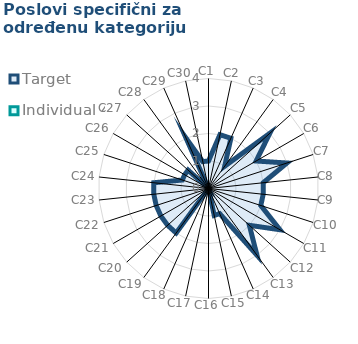
| Category | Target | Individual 4 |
|---|---|---|
| C1 | 1 | 0 |
| C2 | 2 | 0 |
| C3 | 2 | 0 |
| C4 | 1 | 0 |
| C5 | 3 | 0 |
| C6 | 2 | 0 |
| C7 | 3 | 0 |
| C8 | 2 | 0 |
| C9 | 2 | 0 |
| C10 | 2 | 0 |
| C11 | 3 | 0 |
| C12 | 2 | 0 |
| C13 | 3 | 0 |
| C14 | 1 | 0 |
| C15 | 1 | 0 |
| C16 | 0 | 0 |
| C17 | 0 | 0 |
| C18 | 0 | 0 |
| C19 | 2 | 0 |
| C20 | 2 | 0 |
| C21 | 2 | 0 |
| C22 | 2 | 0 |
| C23 | 2 | 0 |
| C24 | 2 | 0 |
| C25 | 1 | 0 |
| C26 | 1 | 0 |
| C27 | 1 | 0 |
| C28 | 0 | 0 |
| C29 | 2 | 0 |
| C30 | 1 | 0 |